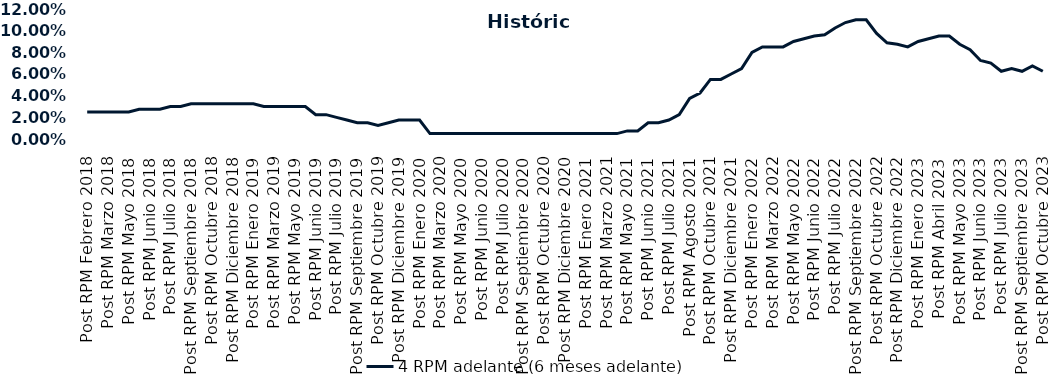
| Category | 4 RPM adelante (6 meses adelante) |
|---|---|
| Post RPM Febrero 2018 | 0.025 |
| Pre RPM Marzo 2018 | 0.025 |
| Post RPM Marzo 2018 | 0.025 |
| Pre RPM Mayo 2018 | 0.025 |
| Post RPM Mayo 2018 | 0.025 |
| Pre RPM Junio 2018 | 0.028 |
| Post RPM Junio 2018 | 0.028 |
| Pre RPM Julio 2018 | 0.028 |
| Post RPM Julio 2018 | 0.03 |
| Pre RPM Septiembre 2018 | 0.03 |
| Post RPM Septiembre 2018 | 0.032 |
| Pre RPM Octubre 2018 | 0.032 |
| Post RPM Octubre 2018 | 0.032 |
| Pre RPM Diciembre 2018 | 0.032 |
| Post RPM Diciembre 2018 | 0.032 |
| Pre RPM Enero 2019 | 0.032 |
| Post RPM Enero 2019 | 0.032 |
| Pre RPM Marzo 2019 | 0.03 |
| Post RPM Marzo 2019 | 0.03 |
| Pre RPM Mayo 2019 | 0.03 |
| Post RPM Mayo 2019 | 0.03 |
| Pre RPM Junio 2019 | 0.03 |
| Post RPM Junio 2019 | 0.022 |
| Pre RPM Julio 2019 | 0.022 |
| Post RPM Julio 2019 | 0.02 |
| Pre RPM Septiembre 2019 | 0.018 |
| Post RPM Septiembre 2019 | 0.015 |
| Pre RPM Octubre 2019 | 0.015 |
| Post RPM Octubre 2019 | 0.012 |
| Pre RPM Diciembre 2019 | 0.015 |
| Post RPM Diciembre 2019 | 0.018 |
| Pre RPM Enero 2020 | 0.018 |
| Post RPM Enero 2020 | 0.018 |
| Pre RPM Marzo 2020 | 0.005 |
| Post RPM Marzo 2020 | 0.005 |
| Pre RPM Mayo 2020 | 0.005 |
| Post RPM Mayo 2020 | 0.005 |
| Pre RPM Junio 2020 | 0.005 |
| Post RPM Junio 2020 | 0.005 |
| Pre RPM Julio 2020 | 0.005 |
| Post RPM Julio 2020 | 0.005 |
| Pre RPM Septiembre 2020 | 0.005 |
| Post RPM Septiembre 2020 | 0.005 |
| Pre RPM Octubre 2020 | 0.005 |
| Post RPM Octubre 2020 | 0.005 |
| Pre RPM Diciembre 2020 | 0.005 |
| Post RPM Diciembre 2020 | 0.005 |
| Pre RPM Enero 2021 | 0.005 |
| Post RPM Enero 2021 | 0.005 |
| Pre RPM Marzo 2021 | 0.005 |
| Post RPM Marzo 2021 | 0.005 |
| Pre RPM Mayo 2021 | 0.005 |
| Post RPM Mayo 2021 | 0.008 |
| Pre RPM Junio 2021 | 0.008 |
| Post RPM Junio 2021 | 0.015 |
| Pre RPM Julio 2021 | 0.015 |
| Post RPM Julio 2021 | 0.018 |
| Pre RPM Agosto 2021 | 0.022 |
| Post RPM Agosto 2021 | 0.038 |
| Pre RPM Octubre 2021 | 0.042 |
| Post RPM Octubre 2021 | 0.055 |
| Pre RPM Diciembre 2021 | 0.055 |
| Post RPM Diciembre 2021 | 0.06 |
| Pre RPM Enero 2022 | 0.065 |
| Post RPM Enero 2022 | 0.08 |
| Pre RPM Marzo 2022 | 0.085 |
| Post RPM Marzo 2022 | 0.085 |
| Pre RPM Mayo 2022 | 0.085 |
| Post RPM Mayo 2022 | 0.09 |
| Pre RPM Junio 2022 | 0.092 |
| Post RPM Junio 2022 | 0.095 |
| Pre RPM Julio 2022 | 0.096 |
| Post RPM Julio 2022 | 0.102 |
| Pre RPM Septiembre 2022 | 0.108 |
| Post RPM Septiembre 2022 | 0.11 |
| Pre RPM Octubre 2022 | 0.11 |
| Post RPM Octubre 2022 | 0.098 |
| Pre RPM Diciembre 2022 | 0.089 |
| Post RPM Diciembre 2022 | 0.088 |
| Pre RPM Enero 2023 | 0.085 |
| Post RPM Enero 2023 | 0.09 |
| Pre RPM Abril 2023 | 0.092 |
| Post RPM Abril 2023 | 0.095 |
| Pre RPM Mayo 2023 | 0.095 |
| Post RPM Mayo 2023 | 0.088 |
| Pre RPM Junio 2023 | 0.082 |
| Post RPM Junio 2023 | 0.072 |
| Pre RPM Julio 2023 | 0.07 |
| Post RPM Julio 2023 | 0.062 |
| Pre RPM Septiembre 2023 | 0.065 |
| Post RPM Septiembre 2023 | 0.062 |
| Pre RPM Octubre 2023 | 0.068 |
| Post RPM Octubre 2023 | 0.062 |